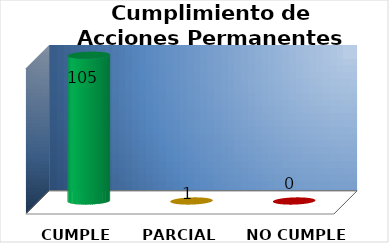
| Category | Series 0 |
|---|---|
| CUMPLE | 105 |
| PARCIAL | 1 |
| NO CUMPLE | 0 |